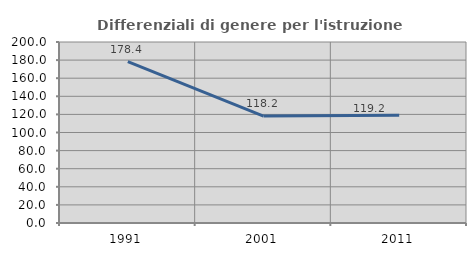
| Category | Differenziali di genere per l'istruzione superiore |
|---|---|
| 1991.0 | 178.415 |
| 2001.0 | 118.182 |
| 2011.0 | 119.184 |